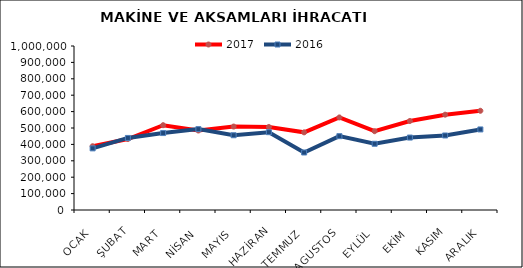
| Category | 2017 | 2016 |
|---|---|---|
| OCAK | 388792.404 | 375776.247 |
| ŞUBAT | 432739.174 | 439341.668 |
| MART | 517119.976 | 469119.05 |
| NİSAN | 484675.827 | 493135.055 |
| MAYIS | 508786.024 | 455821.913 |
| HAZİRAN | 506151.887 | 474529.239 |
| TEMMUZ | 473490.468 | 350671.083 |
| AGUSTOS | 564410.82 | 450226.813 |
| EYLÜL | 480407.033 | 403847.48 |
| EKİM | 542645.003 | 441725.156 |
| KASIM | 581224.126 | 454398.987 |
| ARALIK | 605010.68 | 491196.677 |